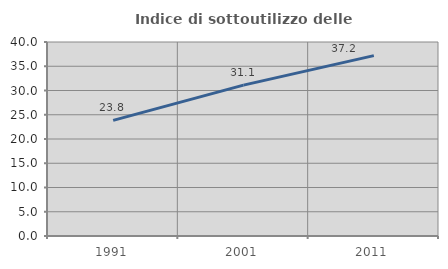
| Category | Indice di sottoutilizzo delle abitazioni  |
|---|---|
| 1991.0 | 23.843 |
| 2001.0 | 31.114 |
| 2011.0 | 37.19 |